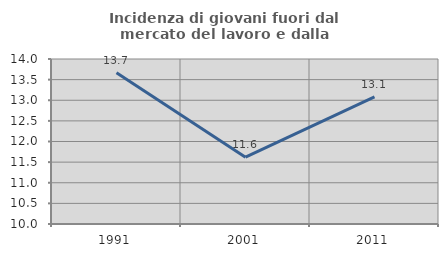
| Category | Incidenza di giovani fuori dal mercato del lavoro e dalla formazione  |
|---|---|
| 1991.0 | 13.667 |
| 2001.0 | 11.621 |
| 2011.0 | 13.084 |